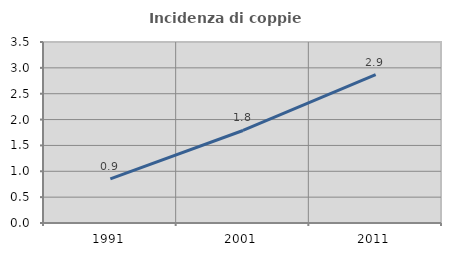
| Category | Incidenza di coppie miste |
|---|---|
| 1991.0 | 0.854 |
| 2001.0 | 1.789 |
| 2011.0 | 2.867 |